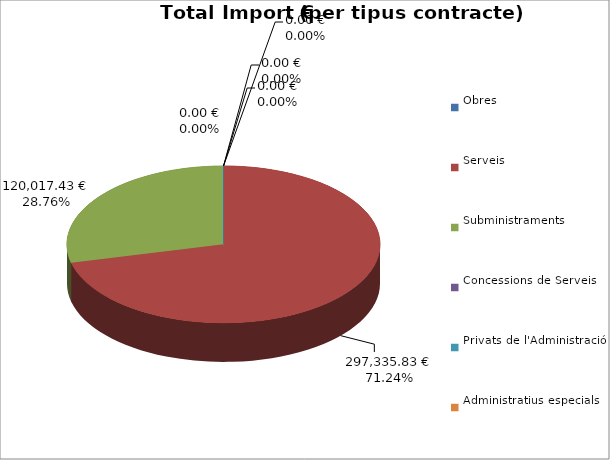
| Category | Total preu
(amb IVA) |
|---|---|
| Obres | 0 |
| Serveis | 297335.83 |
| Subministraments | 120017.43 |
| Concessions de Serveis | 0 |
| Privats de l'Administració | 0 |
| Administratius especials | 0 |